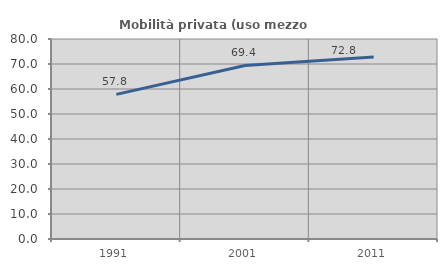
| Category | Mobilità privata (uso mezzo privato) |
|---|---|
| 1991.0 | 57.846 |
| 2001.0 | 69.421 |
| 2011.0 | 72.77 |